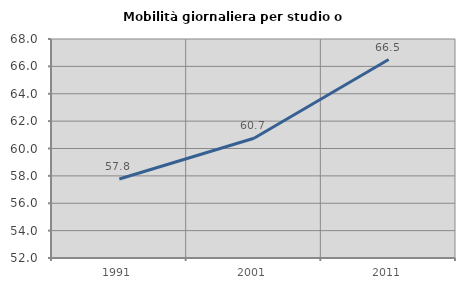
| Category | Mobilità giornaliera per studio o lavoro |
|---|---|
| 1991.0 | 57.77 |
| 2001.0 | 60.748 |
| 2011.0 | 66.497 |